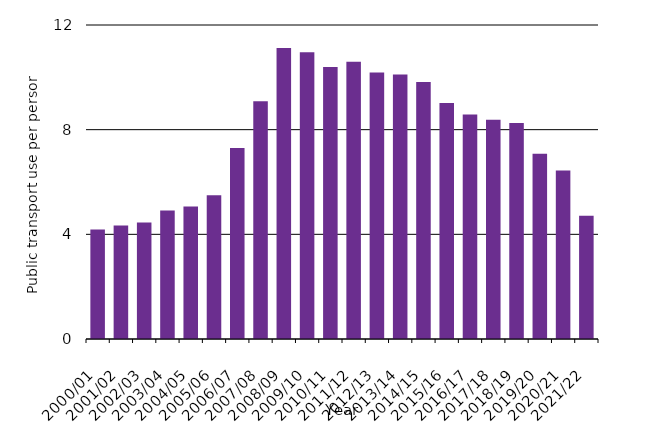
| Category | Public transport boardings per resident per annum |
|---|---|
| 2000/01 | 4.18 |
| 2001/02 | 4.339 |
| 2002/03 | 4.457 |
| 2003/04 | 4.915 |
| 2004/05 | 5.068 |
| 2005/06 | 5.493 |
| 2006/07 | 7.299 |
| 2007/08 | 9.089 |
| 2008/09 | 11.117 |
| 2009/10 | 10.96 |
| 2010/11 | 10.397 |
| 2011/12 | 10.596 |
| 2012/13 | 10.181 |
| 2013/14 | 10.108 |
| 2014/15 | 9.82 |
| 2015/16 | 9.023 |
| 2016/17 | 8.577 |
| 2017/18 | 8.384 |
| 2018/19 | 8.253 |
| 2019/20 | 7.08 |
| 2020/21 | 6.439 |
| 2021/22 | 4.706 |